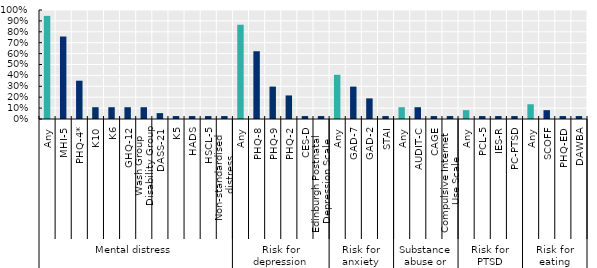
| Category | Series 0 |
|---|---|
| 0 | 0.946 |
| 1 | 0.757 |
| 2 | 0.351 |
| 3 | 0.108 |
| 4 | 0.108 |
| 5 | 0.108 |
| 6 | 0.108 |
| 7 | 0.054 |
| 8 | 0.027 |
| 9 | 0.027 |
| 10 | 0.027 |
| 11 | 0.027 |
| 12 | 0.865 |
| 13 | 0.622 |
| 14 | 0.297 |
| 15 | 0.216 |
| 16 | 0.027 |
| 17 | 0.027 |
| 18 | 0.405 |
| 19 | 0.297 |
| 20 | 0.189 |
| 21 | 0.027 |
| 22 | 0.108 |
| 23 | 0.108 |
| 24 | 0.027 |
| 25 | 0.027 |
| 26 | 0.081 |
| 27 | 0.027 |
| 28 | 0.027 |
| 29 | 0.027 |
| 30 | 0.135 |
| 31 | 0.081 |
| 32 | 0.027 |
| 33 | 0.027 |